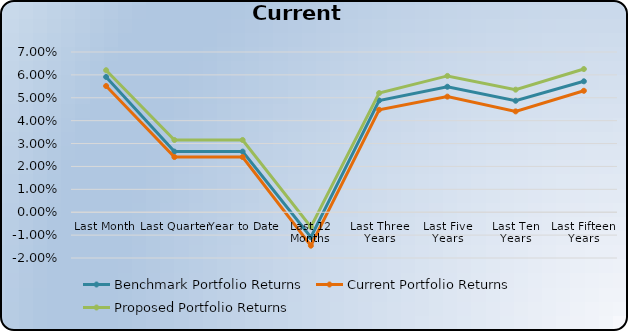
| Category | Benchmark Portfolio Returns | Current Portfolio Returns | Proposed Portfolio Returns |
|---|---|---|---|
| Last Month | 0.059 | 0.055 | 0.062 |
| Last Quarter | 0.026 | 0.024 | 0.032 |
| Year to Date | 0.026 | 0.024 | 0.032 |
| Last 12 Months | -0.011 | -0.015 | -0.006 |
| Last Three Years | 0.049 | 0.045 | 0.052 |
| Last Five Years | 0.055 | 0.05 | 0.06 |
| Last Ten Years | 0.049 | 0.044 | 0.054 |
| Last Fifteen Years | 0.057 | 0.053 | 0.063 |